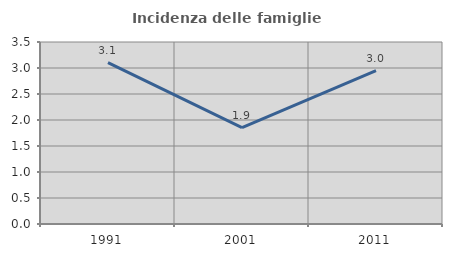
| Category | Incidenza delle famiglie numerose |
|---|---|
| 1991.0 | 3.105 |
| 2001.0 | 1.854 |
| 2011.0 | 2.951 |